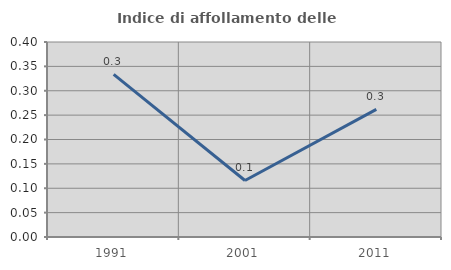
| Category | Indice di affollamento delle abitazioni  |
|---|---|
| 1991.0 | 0.334 |
| 2001.0 | 0.116 |
| 2011.0 | 0.262 |